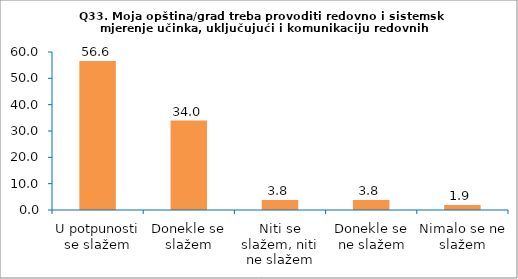
| Category | Series 0 |
|---|---|
| U potpunosti se slažem | 56.604 |
| Donekle se slažem | 33.962 |
| Niti se slažem, niti ne slažem | 3.774 |
| Donekle se ne slažem | 3.774 |
| Nimalo se ne slažem | 1.887 |